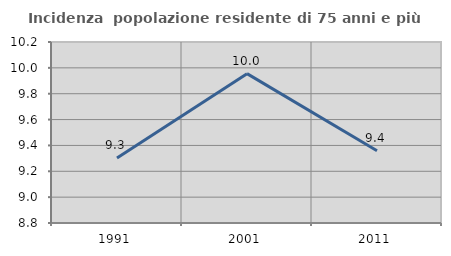
| Category | Incidenza  popolazione residente di 75 anni e più |
|---|---|
| 1991.0 | 9.302 |
| 2001.0 | 9.955 |
| 2011.0 | 9.358 |